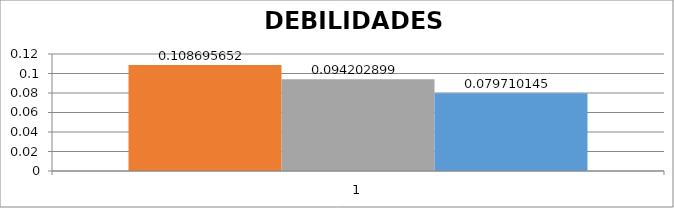
| Category | Infraestructura tecnológica obsoleta, insuficiente o inestable   | Falta de personal para la composición de los  equipos de trabajo | La infraestructura de las oficinas inadecuada  |
|---|---|---|---|
| 0 | 0.109 | 0.094 | 0.08 |